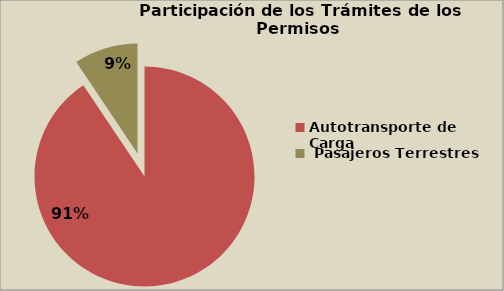
| Category | Series 0 |
|---|---|
| Autotransporte de Carga  | 90.61 |
|  Pasajeros Terrestres | 9.39 |